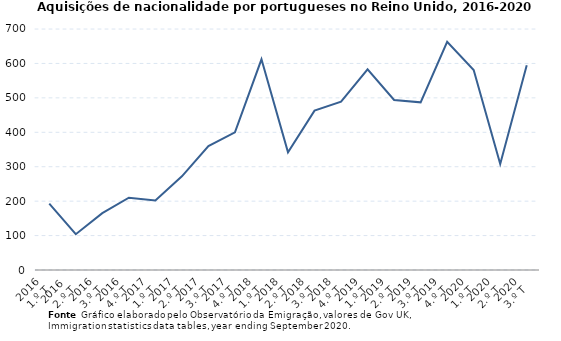
| Category | Series 0 |
|---|---|
| 2016
1.º T | 193 |
| 2016 
2.º T | 104 |
| 2016
3.º T | 165 |
| 2016
4.º T | 210 |
| 2017
1.º T | 202 |
| 2017
2.º T | 272 |
| 2017
3.º T | 360 |
| 2017
4.º T | 400 |
| 2018
1.º T | 612 |
| 2018
2.º T | 342 |
| 2018
3.º T | 463 |
| 2018
4.º T | 489 |
| 2019
1.º T | 583 |
| 2019
2.º T | 494 |
| 2019
3.º T | 487 |
| 2019
4.º T | 663 |
| 2020
1.º T | 581 |
| 2020
2.º T | 308 |
| 2020
3.º T | 595 |